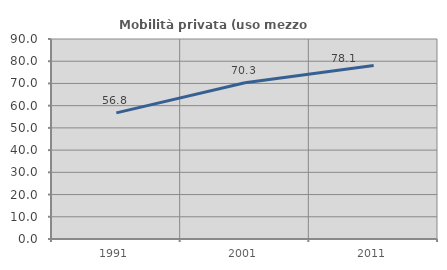
| Category | Mobilità privata (uso mezzo privato) |
|---|---|
| 1991.0 | 56.763 |
| 2001.0 | 70.326 |
| 2011.0 | 78.113 |